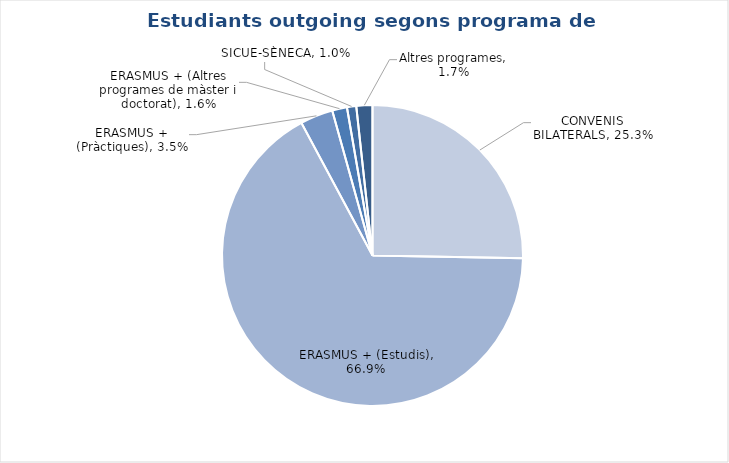
| Category | Estudiants outgoing segons programa de mobilitat |
|---|---|
| CONVENIS BILATERALS | 0.253 |
| ERASMUS + (Estudis) | 0.669 |
| ERASMUS + (Pràctiques) | 0.035 |
| ERASMUS + (Altres programes de màster i doctorat) | 0.016 |
| SICUE-SÈNECA | 0.01 |
| Altres programes | 0.017 |